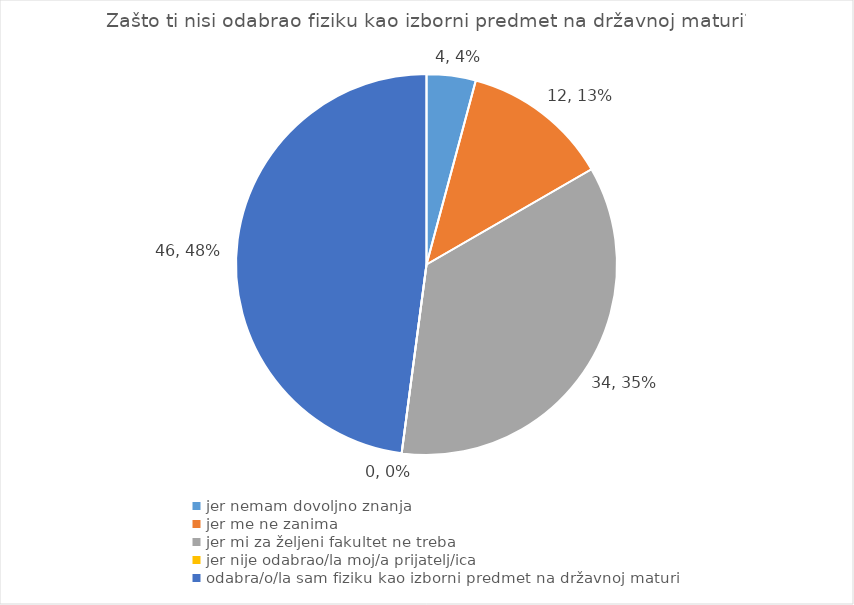
| Category | Series 0 |
|---|---|
| jer nemam dovoljno znanja | 4 |
| jer me ne zanima | 12 |
| jer mi za željeni fakultet ne treba | 34 |
| jer nije odabrao/la moj/a prijatelj/ica | 0 |
| odabra/o/la sam fiziku kao izborni predmet na državnoj maturi | 46 |